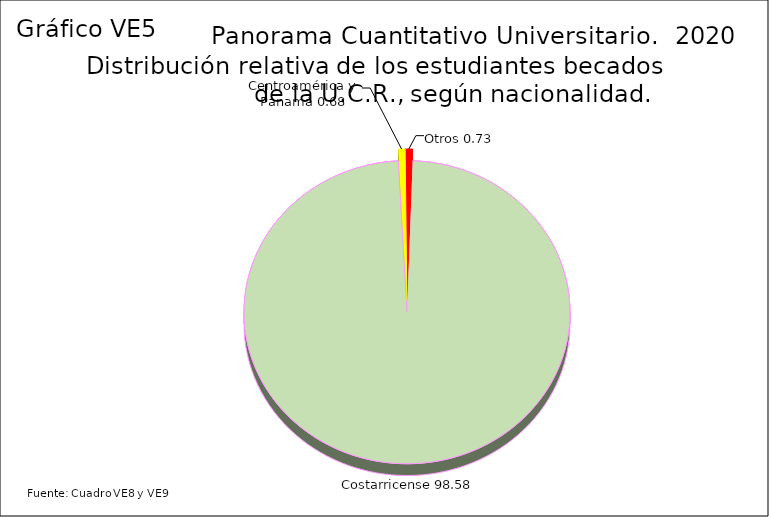
| Category | Series 3 |
|---|---|
| Costarricense | 98.58 |
| Centroamérica y Panamá | 0.68 |
| Otros | 0.73 |